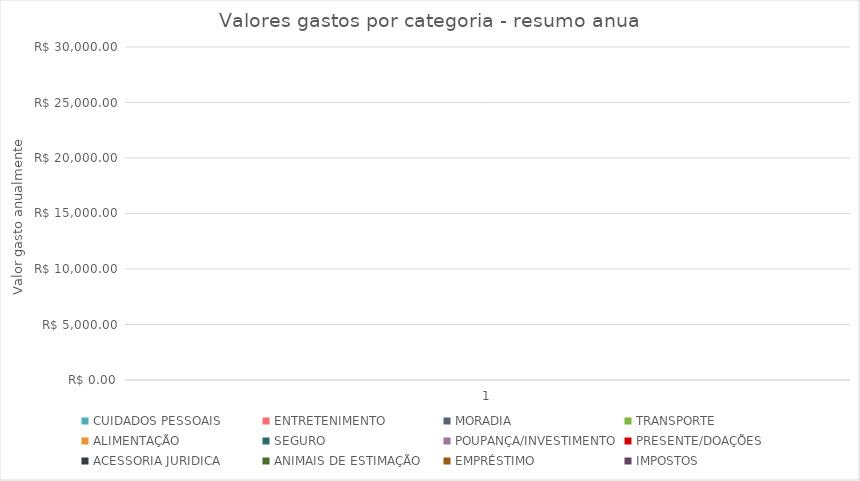
| Category | CUIDADOS PESSOAIS | ENTRETENIMENTO | MORADIA | TRANSPORTE | ALIMENTAÇÃO | SEGURO | POUPANÇA/INVESTIMENTO | PRESENTE/DOAÇÕES | ACESSORIA JURIDICA | ANIMAIS DE ESTIMAÇÃO | EMPRÉSTIMO | IMPOSTOS |
|---|---|---|---|---|---|---|---|---|---|---|---|---|
| 0 | 0 | 0 | 0 | 0 | 0 | 0 | 0 | 0 | 0 | 0 | 0 | 0 |